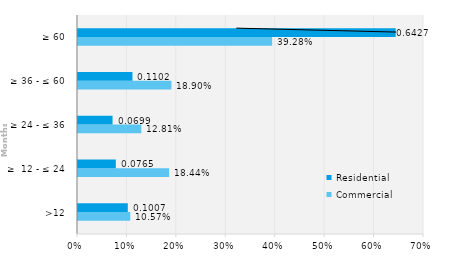
| Category | Commercial | Residential |
|---|---|---|
| >12 | 0.106 | 0.101 |
| ≥  12 - ≤ 24 | 0.184 | 0.076 |
| ≥ 24 - ≤ 36 | 0.128 | 0.07 |
| ≥ 36 - ≤ 60 | 0.189 | 0.11 |
| ≥ 60 | 0.393 | 0.643 |